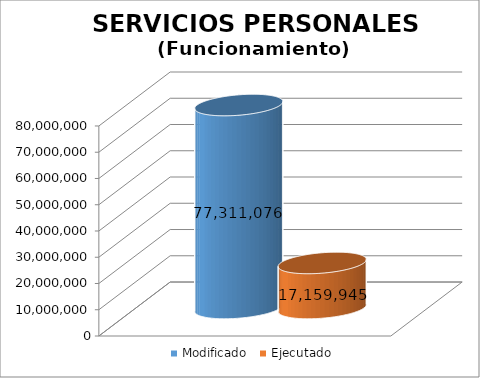
| Category | Modificado | Ejecutado |
|---|---|---|
| 0 | 77311076 | 17159944.95 |